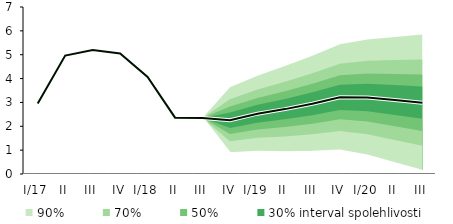
| Category | linka | Centerline |
|---|---|---|
| I/17 | 2.952 | 2.952 |
| II | 4.963 | 4.963 |
| III | 5.197 | 5.197 |
| IV | 5.048 | 5.048 |
| I/18 | 4.071 | 4.071 |
| II | 2.362 | 2.362 |
| III | 2.352 | 2.352 |
| IV | 2.253 | 2.253 |
| I/19 | 2.529 | 2.529 |
| II | 2.72 | 2.72 |
| III | 2.946 | 2.946 |
| IV | 3.213 | 3.213 |
| I/20 | 3.206 | 3.206 |
| II | 3.098 | 3.098 |
| III | 2.991 | 2.991 |